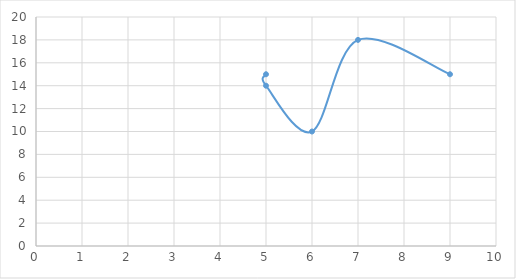
| Category | Series 0 |
|---|---|
| 5.0 | 15 |
| 5.0 | 14 |
| 6.0 | 10 |
| 7.0 | 18 |
| 9.0 | 15 |